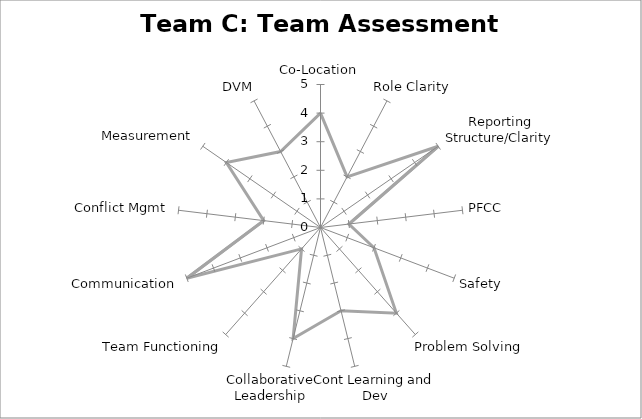
| Category | Series 0 |
|---|---|
| Co-Location | 4 |
| Role Clarity | 2 |
| Reporting Structure/Clarity | 5 |
| PFCC | 1 |
| Safety | 2 |
| Problem Solving | 4 |
| Cont Learning and Dev | 3 |
| Collaborative Leadership | 4 |
| Team Functioning | 1 |
| Communication | 5 |
| Conflict Mgmt | 2 |
| Measurement | 4 |
| DVM | 3 |